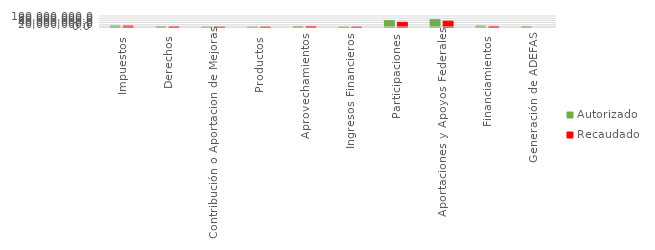
| Category | Autorizado | Recaudado |
|---|---|---|
| Impuestos | 9314383 | 8597818.4 |
| Derechos | 2568365 | 2267395.9 |
| Contribución o Aportacion de Mejoras | 164609 | 174418.5 |
| Productos | 246094 | 214645.1 |
| Aprovechamientos | 5092125 | 4831122.4 |
| Ingresos Financieros | 250000 | 285676 |
| Participaciones | 58073903 | 43011482.8 |
| Aportaciones y Apoyos Federales | 66633413 | 52869197.5 |
| Financiamientos | 8562000 | 5189914.6 |
| Generación de ADEFAS | 2460661 | 0 |